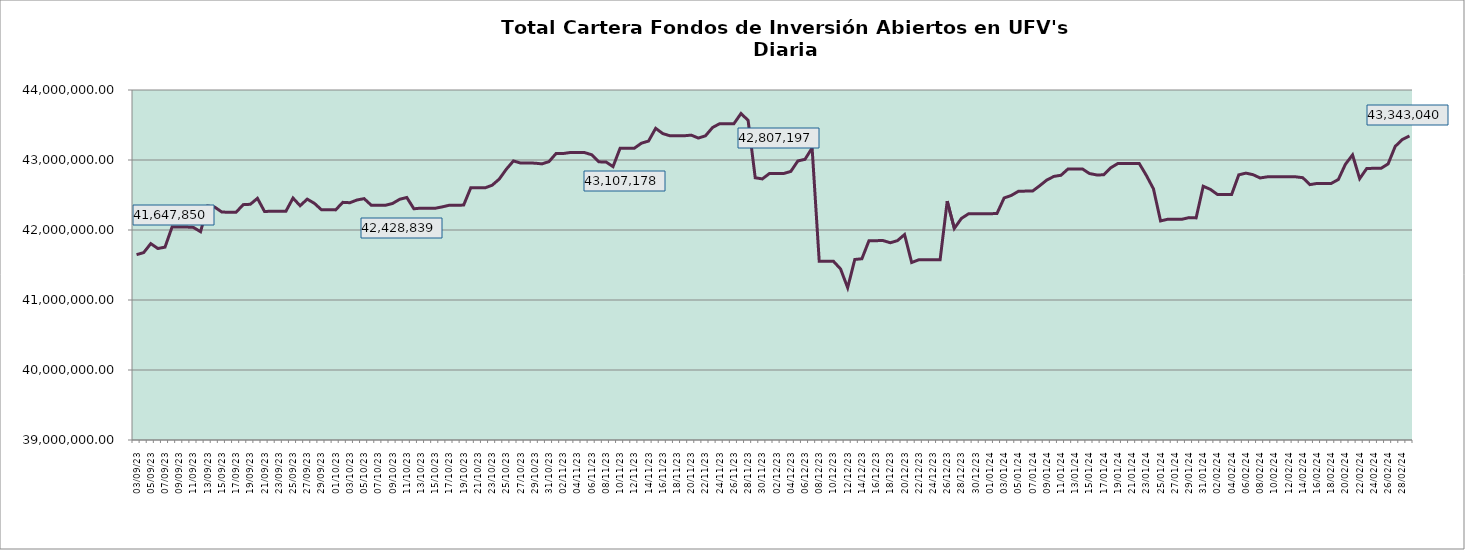
| Category | Cartera |
|---|---|
| 2023-09-03 | 41647849.67 |
| 2023-09-04 | 41676927.49 |
| 2023-09-05 | 41805487.28 |
| 2023-09-06 | 41735369.04 |
| 2023-09-07 | 41755206.18 |
| 2023-09-08 | 42043641.71 |
| 2023-09-09 | 42043028.37 |
| 2023-09-10 | 42042422.03 |
| 2023-09-11 | 42036906.74 |
| 2023-09-12 | 41975855.01 |
| 2023-09-13 | 42342509.7 |
| 2023-09-14 | 42326533.24 |
| 2023-09-15 | 42255754.6 |
| 2023-09-16 | 42254713.29 |
| 2023-09-17 | 42253678.62 |
| 2023-09-18 | 42362270.42 |
| 2023-09-19 | 42367252.26 |
| 2023-09-20 | 42452605.95 |
| 2023-09-21 | 42263697.89 |
| 2023-09-22 | 42269201.01 |
| 2023-09-23 | 42268191.65 |
| 2023-09-24 | 42267202 |
| 2023-09-25 | 42456350.25 |
| 2023-09-26 | 42346714.77 |
| 2023-09-27 | 42440978.47 |
| 2023-09-28 | 42381579.11 |
| 2023-09-29 | 42289102.56 |
| 2023-09-30 | 42288198.85 |
| 2023-10-01 | 42287410.93 |
| 2023-10-02 | 42395019.87 |
| 2023-10-03 | 42389780.2 |
| 2023-10-04 | 42428838.54 |
| 2023-10-05 | 42447910.21 |
| 2023-10-06 | 42354744.63 |
| 2023-10-07 | 42353951.46 |
| 2023-10-08 | 42353157.81 |
| 2023-10-09 | 42378630.44 |
| 2023-10-10 | 42438859.82 |
| 2023-10-11 | 42464556.73 |
| 2023-10-12 | 42303351.79 |
| 2023-10-13 | 42312277.18 |
| 2023-10-14 | 42311563.61 |
| 2023-10-15 | 42310863.49 |
| 2023-10-16 | 42330496.99 |
| 2023-10-17 | 42354399.37 |
| 2023-10-18 | 42352016.37 |
| 2023-10-19 | 42356548.36 |
| 2023-10-20 | 42603214.79 |
| 2023-10-21 | 42602528.51 |
| 2023-10-22 | 42601916.62 |
| 2023-10-23 | 42639157.05 |
| 2023-10-24 | 42726911.12 |
| 2023-10-25 | 42868514.71 |
| 2023-10-26 | 42986683.86 |
| 2023-10-27 | 42956471.69 |
| 2023-10-28 | 42955894.05 |
| 2023-10-29 | 42955238.7 |
| 2023-10-30 | 42944597.6 |
| 2023-10-31 | 42976802.28 |
| 2023-11-01 | 43093358.77 |
| 2023-11-02 | 43092484.46 |
| 2023-11-03 | 43107178.36 |
| 2023-11-04 | 43106690.27 |
| 2023-11-05 | 43106091.65 |
| 2023-11-06 | 43074970.72 |
| 2023-11-07 | 42973358.77 |
| 2023-11-08 | 42972674.39 |
| 2023-11-09 | 42905181.05 |
| 2023-11-10 | 43168443.62 |
| 2023-11-11 | 43168308.58 |
| 2023-11-12 | 43168113.82 |
| 2023-11-13 | 43240373.99 |
| 2023-11-14 | 43270689.6 |
| 2023-11-15 | 43452656.87 |
| 2023-11-16 | 43377305.54 |
| 2023-11-17 | 43346398.83 |
| 2023-11-18 | 43346275.14 |
| 2023-11-19 | 43345996.41 |
| 2023-11-20 | 43355290.36 |
| 2023-11-21 | 43313520.47 |
| 2023-11-22 | 43345046.77 |
| 2023-11-23 | 43463951.13 |
| 2023-11-24 | 43518849.38 |
| 2023-11-25 | 43518689.33 |
| 2023-11-26 | 43518613.5 |
| 2023-11-27 | 43663890.35 |
| 2023-11-28 | 43566224.18 |
| 2023-11-29 | 42746411.65 |
| 2023-11-30 | 42729756.9 |
| 2023-12-01 | 42807258.98 |
| 2023-12-02 | 42807197.19 |
| 2023-12-03 | 42807092.44 |
| 2023-12-04 | 42836421.66 |
| 2023-12-05 | 42986681.9 |
| 2023-12-06 | 43009721.06 |
| 2023-12-07 | 43172268.64 |
| 2023-12-08 | 41553464.95 |
| 2023-12-09 | 41553353.58 |
| 2023-12-10 | 41553233.21 |
| 2023-12-11 | 41443536.84 |
| 2023-12-12 | 41175240.65 |
| 2023-12-13 | 41578691.31 |
| 2023-12-14 | 41589415.94 |
| 2023-12-15 | 41848065.8 |
| 2023-12-16 | 41848147.79 |
| 2023-12-17 | 41848333.27 |
| 2023-12-18 | 41817881.84 |
| 2023-12-19 | 41848149.89 |
| 2023-12-20 | 41934834.15 |
| 2023-12-21 | 41535661.54 |
| 2023-12-22 | 41574569.14 |
| 2023-12-23 | 41574677.24 |
| 2023-12-24 | 41574915.52 |
| 2023-12-25 | 41575088.47 |
| 2023-12-26 | 42411895.63 |
| 2023-12-27 | 42022821.12 |
| 2023-12-28 | 42166018.8 |
| 2023-12-29 | 42231460.7 |
| 2023-12-30 | 42231676.24 |
| 2023-12-31 | 42231796.91 |
| 2024-01-01 | 42231903.29 |
| 2024-01-02 | 42236447.68 |
| 2024-01-03 | 42457468.24 |
| 2024-01-04 | 42493086.93 |
| 2024-01-05 | 42552233.95 |
| 2024-01-06 | 42555635.47 |
| 2024-01-07 | 42555772.03 |
| 2024-01-08 | 42632171.02 |
| 2024-01-09 | 42713507.47 |
| 2024-01-10 | 42765649.93 |
| 2024-01-11 | 42781927.93 |
| 2024-01-12 | 42873045.01 |
| 2024-01-13 | 42872948.65 |
| 2024-01-14 | 42872965.72 |
| 2024-01-15 | 42806763.91 |
| 2024-01-16 | 42787008.27 |
| 2024-01-17 | 42787779.66 |
| 2024-01-18 | 42889319.06 |
| 2024-01-19 | 42949948.17 |
| 2024-01-20 | 42949910.14 |
| 2024-01-21 | 42949843.04 |
| 2024-01-22 | 42950154.71 |
| 2024-01-23 | 42780085 |
| 2024-01-24 | 42588321.27 |
| 2024-01-25 | 42129616.68 |
| 2024-01-26 | 42153365.84 |
| 2024-01-27 | 42153328.67 |
| 2024-01-28 | 42153251.57 |
| 2024-01-29 | 42176857.54 |
| 2024-01-30 | 42172961.56 |
| 2024-01-31 | 42625272.49 |
| 2024-02-01 | 42580649.66 |
| 2024-02-02 | 42507552.44 |
| 2024-02-03 | 42508595.87 |
| 2024-02-04 | 42508465.54 |
| 2024-02-05 | 42788057.39 |
| 2024-02-06 | 42812646.43 |
| 2024-02-07 | 42790521.11 |
| 2024-02-08 | 42743407.01 |
| 2024-02-09 | 42759377.75 |
| 2024-02-10 | 42759558.11 |
| 2024-02-11 | 42759660.06 |
| 2024-02-12 | 42759630.18 |
| 2024-02-13 | 42759774.39 |
| 2024-02-14 | 42747375.12 |
| 2024-02-15 | 42648197.65 |
| 2024-02-16 | 42664957.54 |
| 2024-02-17 | 42665070.71 |
| 2024-02-18 | 42665250.87 |
| 2024-02-19 | 42721359.54 |
| 2024-02-20 | 42939860.3 |
| 2024-02-21 | 43072861.01 |
| 2024-02-22 | 42733090.52 |
| 2024-02-23 | 42879774.39 |
| 2024-02-24 | 42880645.66 |
| 2024-02-25 | 42880813.12 |
| 2024-02-26 | 42944216.65 |
| 2024-02-27 | 43194675.62 |
| 2024-02-28 | 43292910.55 |
| 2024-02-29 | 43343039.86 |